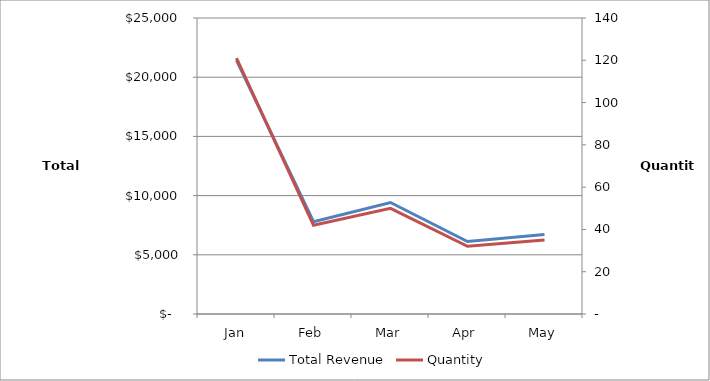
| Category | Total Revenue |
|---|---|
| Jan | 21422.1 |
| Feb | 7795.2 |
| Mar | 9414.84 |
| Apr | 6120.9 |
| May | 6718.6 |